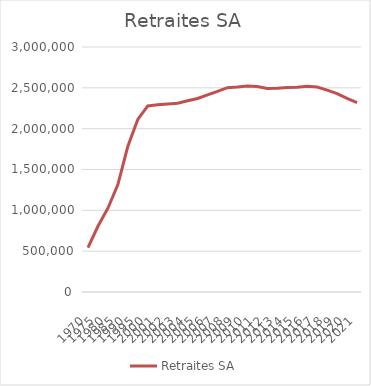
| Category | Retraites SA |
|---|---|
| 1970.0 | 542000 |
| 1975.0 | 805000 |
| 1980.0 | 1025914 |
| 1985.0 | 1315144 |
| 1990.0 | 1784595 |
| 1995.0 | 2112442 |
| 2000.0 | 2278824 |
| 2001.0 | 2292176 |
| 2002.0 | 2302166 |
| 2003.0 | 2311276 |
| 2004.0 | 2341333 |
| 2005.0 | 2369113 |
| 2006.0 | 2412941 |
| 2007.0 | 2457406 |
| 2008.0 | 2501653 |
| 2009.0 | 2509526 |
| 2010.0 | 2520973 |
| 2011.0 | 2514936 |
| 2012.0 | 2492472 |
| 2013.0 | 2495126 |
| 2014.0 | 2503516 |
| 2015.0 | 2507737 |
| 2016.0 | 2519377 |
| 2017.0 | 2509483 |
| 2018.0 | 2472685 |
| 2019.0 | 2430021 |
| 2020.0 | 2370893 |
| 2021.0 | 2317633 |